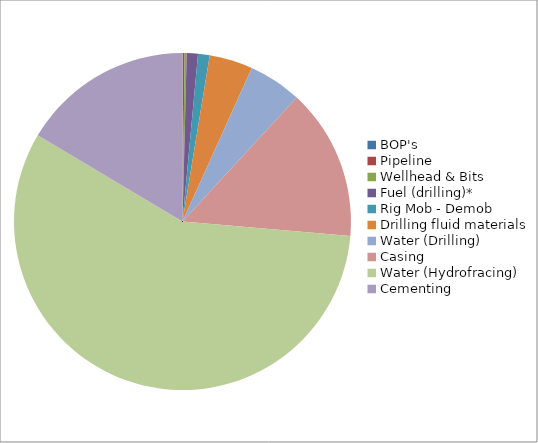
| Category | Series 0 |
|---|---|
| BOP's | 0 |
| Pipeline | 0.002 |
| Wellhead & Bits | 0.002 |
| Fuel (drilling)* | 0.011 |
| Rig Mob - Demob | 0.011 |
| Drilling fluid materials | 0.042 |
| Water (Drilling) | 0.051 |
| Casing | 0.145 |
| Water (Hydrofracing) | 0.572 |
| Cementing | 0.164 |